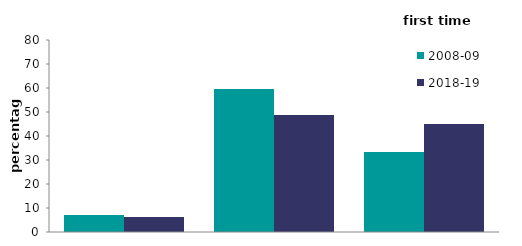
| Category | 2008-09 | 2018-19 |
|---|---|---|
| 1-19 years | 7.08 | 6.295 |
| 20-29 years | 59.606 | 48.736 |
| 30 years or more | 33.314 | 44.968 |